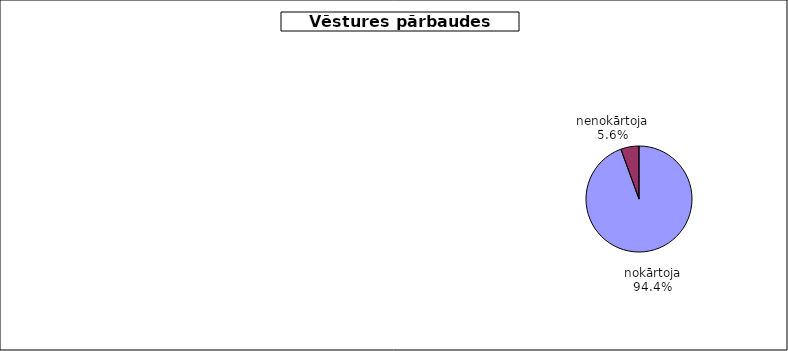
| Category | Series 0 |
|---|---|
| nokārtoja | 0.944 |
| nenokārtoja | 0.056 |